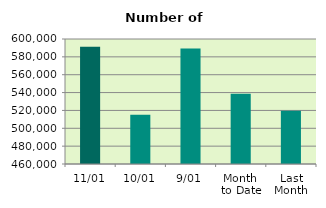
| Category | Series 0 |
|---|---|
| 11/01 | 591230 |
| 10/01 | 515092 |
| 9/01 | 589224 |
| Month 
to Date | 538808 |
| Last
Month | 519611.714 |